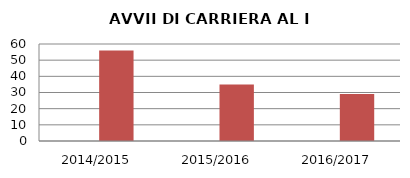
| Category | ANNO | NUMERO |
|---|---|---|
| 2014/2015 | 0 | 56 |
| 2015/2016 | 0 | 35 |
| 2016/2017 | 0 | 29 |